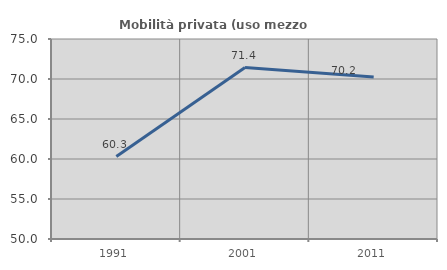
| Category | Mobilità privata (uso mezzo privato) |
|---|---|
| 1991.0 | 60.308 |
| 2001.0 | 71.429 |
| 2011.0 | 70.242 |